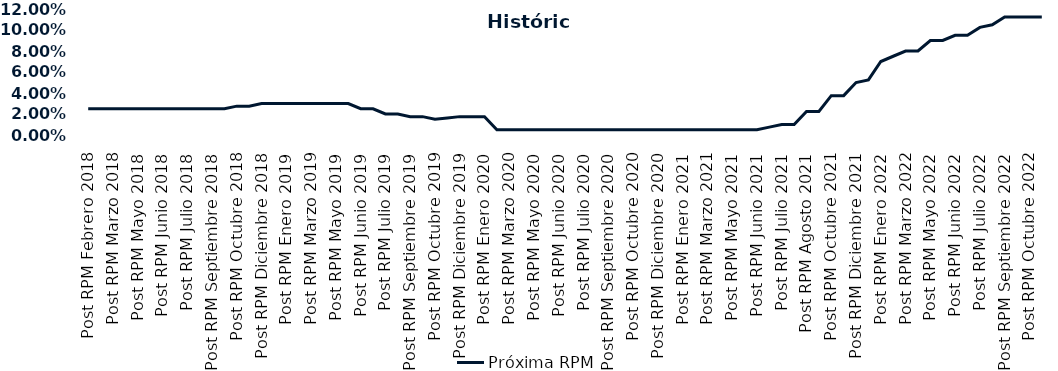
| Category | Próxima RPM |
|---|---|
| Post RPM Febrero 2018 | 0.025 |
| Pre RPM Marzo 2018 | 0.025 |
| Post RPM Marzo 2018 | 0.025 |
| Pre RPM Mayo 2018 | 0.025 |
| Post RPM Mayo 2018 | 0.025 |
| Pre RPM Junio 2018 | 0.025 |
| Post RPM Junio 2018 | 0.025 |
| Pre RPM Julio 2018 | 0.025 |
| Post RPM Julio 2018 | 0.025 |
| Pre RPM Septiembre 2018 | 0.025 |
| Post RPM Septiembre 2018 | 0.025 |
| Pre RPM Octubre 2018 | 0.025 |
| Post RPM Octubre 2018 | 0.028 |
| Pre RPM Diciembre 2018 | 0.028 |
| Post RPM Diciembre 2018 | 0.03 |
| Pre RPM Enero 2019 | 0.03 |
| Post RPM Enero 2019 | 0.03 |
| Pre RPM Marzo 2019 | 0.03 |
| Post RPM Marzo 2019 | 0.03 |
| Pre RPM Mayo 2019 | 0.03 |
| Post RPM Mayo 2019 | 0.03 |
| Pre RPM Junio 2019 | 0.03 |
| Post RPM Junio 2019 | 0.025 |
| Pre RPM Julio 2019 | 0.025 |
| Post RPM Julio 2019 | 0.02 |
| Pre RPM Septiembre 2019 | 0.02 |
| Post RPM Septiembre 2019 | 0.018 |
| Pre RPM Octubre 2019 | 0.018 |
| Post RPM Octubre 2019 | 0.015 |
| Pre RPM Diciembre 2019 | 0.016 |
| Post RPM Diciembre 2019 | 0.018 |
| Pre RPM Enero 2020 | 0.018 |
| Post RPM Enero 2020 | 0.018 |
| Pre RPM Marzo 2020 | 0.005 |
| Post RPM Marzo 2020 | 0.005 |
| Pre RPM Mayo 2020 | 0.005 |
| Post RPM Mayo 2020 | 0.005 |
| Pre RPM Junio 2020 | 0.005 |
| Post RPM Junio 2020 | 0.005 |
| Pre RPM Julio 2020 | 0.005 |
| Post RPM Julio 2020 | 0.005 |
| Pre RPM Septiembre 2020 | 0.005 |
| Post RPM Septiembre 2020 | 0.005 |
| Pre RPM Octubre 2020 | 0.005 |
| Post RPM Octubre 2020 | 0.005 |
| Pre RPM Diciembre 2020 | 0.005 |
| Post RPM Diciembre 2020 | 0.005 |
| Pre RPM Enero 2021 | 0.005 |
| Post RPM Enero 2021 | 0.005 |
| Pre RPM Marzo 2021 | 0.005 |
| Post RPM Marzo 2021 | 0.005 |
| Pre RPM Mayo 2021 | 0.005 |
| Post RPM Mayo 2021 | 0.005 |
| Pre RPM Junio 2021 | 0.005 |
| Post RPM Junio 2021 | 0.005 |
| Pre RPM Julio 2021 | 0.008 |
| Post RPM Julio 2021 | 0.01 |
| Pre RPM Agosto 2021 | 0.01 |
| Post RPM Agosto 2021 | 0.022 |
| Pre RPM Octubre 2021 | 0.022 |
| Post RPM Octubre 2021 | 0.038 |
| Pre RPM Diciembre 2021 | 0.038 |
| Post RPM Diciembre 2021 | 0.05 |
| Pre RPM Enero 2022 | 0.052 |
| Post RPM Enero 2022 | 0.07 |
| Pre RPM Marzo 2022 | 0.075 |
| Post RPM Marzo 2022 | 0.08 |
| Pre RPM Mayo 2022 | 0.08 |
| Post RPM Mayo 2022 | 0.09 |
| Pre RPM Junio 2022 | 0.09 |
| Post RPM Junio 2022 | 0.095 |
| Pre RPM Julio 2022 | 0.095 |
| Post RPM Julio 2022 | 0.102 |
| Pre RPM Septiembre 2022 | 0.105 |
| Post RPM Septiembre 2022 | 0.112 |
| Pre RPM Octubre 2022 | 0.112 |
| Post RPM Octubre 2022 | 0.112 |
| Pre RPM Diciembre 2022 | 0.112 |